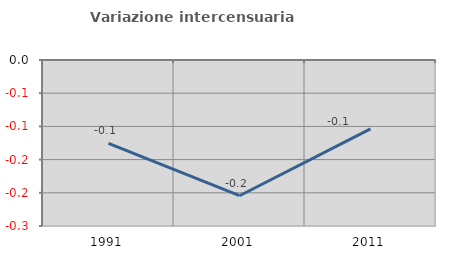
| Category | Variazione intercensuaria annua |
|---|---|
| 1991.0 | -0.126 |
| 2001.0 | -0.204 |
| 2011.0 | -0.104 |